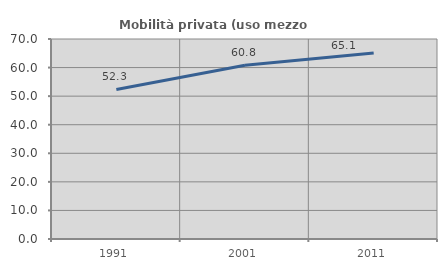
| Category | Mobilità privata (uso mezzo privato) |
|---|---|
| 1991.0 | 52.332 |
| 2001.0 | 60.842 |
| 2011.0 | 65.138 |